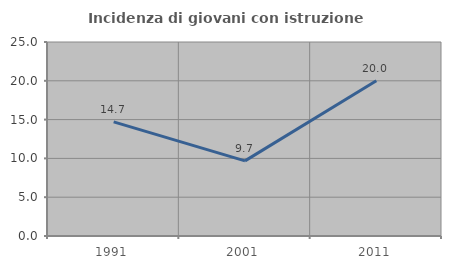
| Category | Incidenza di giovani con istruzione universitaria |
|---|---|
| 1991.0 | 14.706 |
| 2001.0 | 9.677 |
| 2011.0 | 20 |